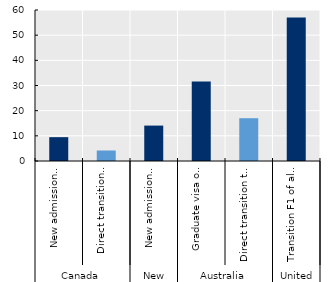
| Category | Series 0 |
|---|---|
| 0 | 9.473 |
| 1 | 4.172 |
| 2 | 14.07 |
| 3 | 31.614 |
| 4 | 17 |
| 5 | 57 |